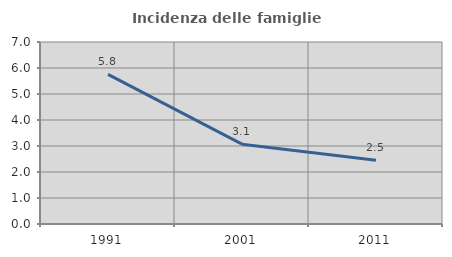
| Category | Incidenza delle famiglie numerose |
|---|---|
| 1991.0 | 5.753 |
| 2001.0 | 3.071 |
| 2011.0 | 2.454 |